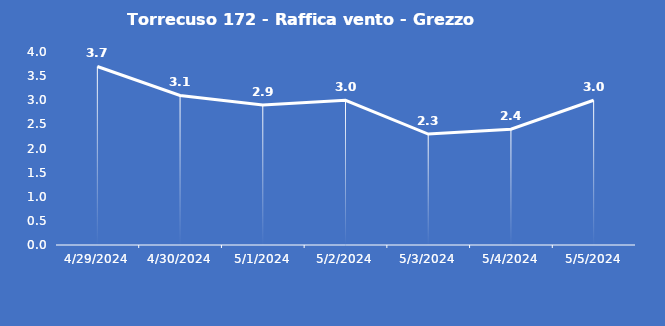
| Category | Torrecuso 172 - Raffica vento - Grezzo (m/s) |
|---|---|
| 4/29/24 | 3.7 |
| 4/30/24 | 3.1 |
| 5/1/24 | 2.9 |
| 5/2/24 | 3 |
| 5/3/24 | 2.3 |
| 5/4/24 | 2.4 |
| 5/5/24 | 3 |